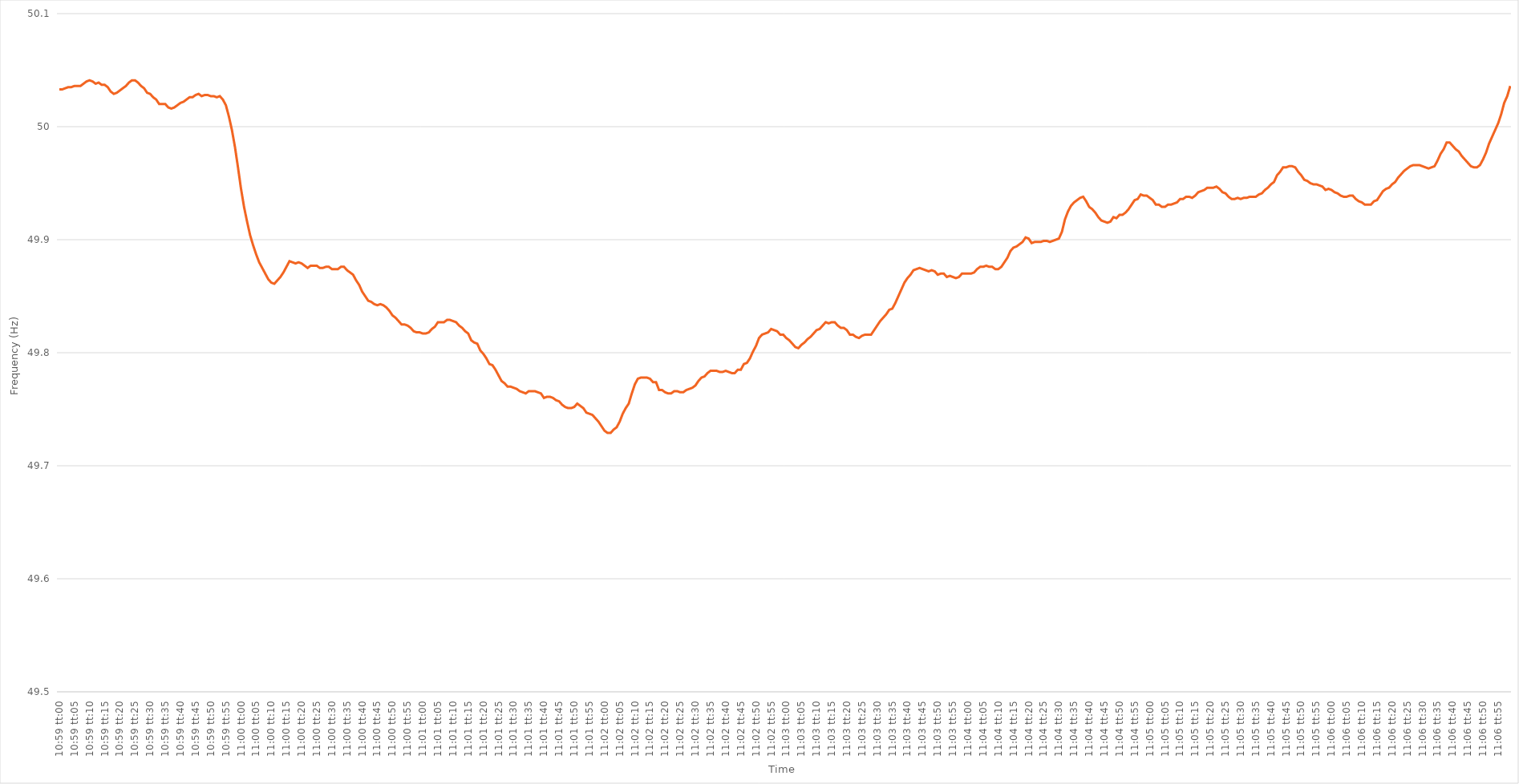
| Category | Series 0 |
|---|---|
| 0.4576388888888889 | 50.033 |
| 0.45765046296296297 | 50.033 |
| 0.457662037037037 | 50.034 |
| 0.4576736111111111 | 50.035 |
| 0.45768518518518514 | 50.035 |
| 0.4576967592592593 | 50.036 |
| 0.45770833333333333 | 50.036 |
| 0.4577199074074074 | 50.036 |
| 0.45773148148148146 | 50.038 |
| 0.45774305555555556 | 50.04 |
| 0.4577546296296296 | 50.041 |
| 0.45776620370370374 | 50.04 |
| 0.4577777777777778 | 50.038 |
| 0.4577893518518519 | 50.039 |
| 0.4578009259259259 | 50.037 |
| 0.4578125 | 50.037 |
| 0.45782407407407405 | 50.035 |
| 0.4578356481481482 | 50.031 |
| 0.45784722222222224 | 50.029 |
| 0.45785879629629633 | 50.03 |
| 0.45787037037037037 | 50.032 |
| 0.4578819444444444 | 50.034 |
| 0.4578935185185185 | 50.036 |
| 0.45790509259259254 | 50.039 |
| 0.4579166666666667 | 50.041 |
| 0.45792824074074073 | 50.041 |
| 0.4579398148148148 | 50.039 |
| 0.45795138888888887 | 50.036 |
| 0.45796296296296296 | 50.034 |
| 0.457974537037037 | 50.03 |
| 0.45798611111111115 | 50.029 |
| 0.4579976851851852 | 50.026 |
| 0.4580092592592593 | 50.024 |
| 0.4580208333333333 | 50.02 |
| 0.4580324074074074 | 50.02 |
| 0.45804398148148145 | 50.02 |
| 0.4580555555555556 | 50.017 |
| 0.45806712962962964 | 50.016 |
| 0.45807870370370374 | 50.017 |
| 0.4580902777777778 | 50.019 |
| 0.4581018518518518 | 50.021 |
| 0.4581134259259259 | 50.022 |
| 0.45812499999999995 | 50.024 |
| 0.4581365740740741 | 50.026 |
| 0.45814814814814814 | 50.026 |
| 0.45815972222222223 | 50.028 |
| 0.45817129629629627 | 50.029 |
| 0.45818287037037037 | 50.027 |
| 0.4581944444444444 | 50.028 |
| 0.45820601851851855 | 50.028 |
| 0.4582175925925926 | 50.027 |
| 0.4582291666666667 | 50.027 |
| 0.4582407407407407 | 50.026 |
| 0.4582523148148148 | 50.027 |
| 0.45826388888888886 | 50.024 |
| 0.458275462962963 | 50.019 |
| 0.45828703703703705 | 50.009 |
| 0.45829861111111114 | 49.997 |
| 0.4583101851851852 | 49.982 |
| 0.4583217592592593 | 49.964 |
| 0.4583333333333333 | 49.945 |
| 0.45834490740740735 | 49.929 |
| 0.4583564814814815 | 49.916 |
| 0.45836805555555554 | 49.904 |
| 0.45837962962962964 | 49.895 |
| 0.4583912037037037 | 49.887 |
| 0.45840277777777777 | 49.88 |
| 0.4584143518518518 | 49.875 |
| 0.45842592592592596 | 49.87 |
| 0.4584375 | 49.865 |
| 0.4584490740740741 | 49.862 |
| 0.45846064814814813 | 49.861 |
| 0.4584722222222222 | 49.864 |
| 0.45848379629629626 | 49.867 |
| 0.4584953703703704 | 49.871 |
| 0.45850694444444445 | 49.876 |
| 0.45851851851851855 | 49.881 |
| 0.4585300925925926 | 49.88 |
| 0.4585416666666667 | 49.879 |
| 0.4585532407407407 | 49.88 |
| 0.45856481481481487 | 49.879 |
| 0.4585763888888889 | 49.877 |
| 0.45858796296296295 | 49.875 |
| 0.45859953703703704 | 49.877 |
| 0.4586111111111111 | 49.877 |
| 0.4586226851851852 | 49.877 |
| 0.4586342592592592 | 49.875 |
| 0.45864583333333336 | 49.875 |
| 0.4586574074074074 | 49.876 |
| 0.4586689814814815 | 49.876 |
| 0.45868055555555554 | 49.874 |
| 0.45869212962962963 | 49.874 |
| 0.45870370370370367 | 49.874 |
| 0.4587152777777778 | 49.876 |
| 0.45872685185185186 | 49.876 |
| 0.45873842592592595 | 49.873 |
| 0.45875 | 49.871 |
| 0.4587615740740741 | 49.869 |
| 0.4587731481481481 | 49.864 |
| 0.4587847222222223 | 49.86 |
| 0.4587962962962963 | 49.854 |
| 0.45880787037037035 | 49.85 |
| 0.45881944444444445 | 49.846 |
| 0.4588310185185185 | 49.845 |
| 0.4588425925925926 | 49.843 |
| 0.4588541666666666 | 49.842 |
| 0.45886574074074077 | 49.843 |
| 0.4588773148148148 | 49.842 |
| 0.4588888888888889 | 49.84 |
| 0.45890046296296294 | 49.837 |
| 0.45891203703703703 | 49.833 |
| 0.4589236111111111 | 49.831 |
| 0.4589351851851852 | 49.828 |
| 0.45894675925925926 | 49.825 |
| 0.45895833333333336 | 49.825 |
| 0.4589699074074074 | 49.824 |
| 0.4589814814814815 | 49.822 |
| 0.45899305555555553 | 49.819 |
| 0.4590046296296297 | 49.818 |
| 0.4590162037037037 | 49.818 |
| 0.4590277777777778 | 49.817 |
| 0.45903935185185185 | 49.817 |
| 0.4590509259259259 | 49.818 |
| 0.4590625 | 49.821 |
| 0.459074074074074 | 49.823 |
| 0.4590856481481482 | 49.827 |
| 0.4590972222222222 | 49.827 |
| 0.4591087962962963 | 49.827 |
| 0.45912037037037035 | 49.829 |
| 0.45913194444444444 | 49.829 |
| 0.4591435185185185 | 49.828 |
| 0.45915509259259263 | 49.827 |
| 0.45916666666666667 | 49.824 |
| 0.45917824074074076 | 49.822 |
| 0.4591898148148148 | 49.819 |
| 0.4592013888888889 | 49.817 |
| 0.45921296296296293 | 49.811 |
| 0.4592245370370371 | 49.809 |
| 0.4592361111111111 | 49.808 |
| 0.4592476851851852 | 49.802 |
| 0.45925925925925926 | 49.799 |
| 0.45927083333333335 | 49.795 |
| 0.4592824074074074 | 49.79 |
| 0.45929398148148143 | 49.789 |
| 0.4593055555555556 | 49.785 |
| 0.4593171296296296 | 49.78 |
| 0.4593287037037037 | 49.775 |
| 0.45934027777777775 | 49.773 |
| 0.45935185185185184 | 49.77 |
| 0.4593634259259259 | 49.77 |
| 0.45937500000000003 | 49.769 |
| 0.45938657407407407 | 49.768 |
| 0.45939814814814817 | 49.766 |
| 0.4594097222222222 | 49.765 |
| 0.4594212962962963 | 49.764 |
| 0.45943287037037034 | 49.766 |
| 0.4594444444444445 | 49.766 |
| 0.4594560185185185 | 49.766 |
| 0.4594675925925926 | 49.765 |
| 0.45947916666666666 | 49.764 |
| 0.45949074074074076 | 49.76 |
| 0.4595023148148148 | 49.761 |
| 0.45951388888888894 | 49.761 |
| 0.459525462962963 | 49.76 |
| 0.459537037037037 | 49.758 |
| 0.4595486111111111 | 49.757 |
| 0.45956018518518515 | 49.754 |
| 0.45957175925925925 | 49.752 |
| 0.4595833333333333 | 49.751 |
| 0.45959490740740744 | 49.751 |
| 0.4596064814814815 | 49.752 |
| 0.45961805555555557 | 49.755 |
| 0.4596296296296296 | 49.753 |
| 0.4596412037037037 | 49.751 |
| 0.45965277777777774 | 49.747 |
| 0.4596643518518519 | 49.746 |
| 0.45967592592592593 | 49.745 |
| 0.4596875 | 49.742 |
| 0.45969907407407407 | 49.739 |
| 0.45971064814814816 | 49.735 |
| 0.4597222222222222 | 49.731 |
| 0.45973379629629635 | 49.729 |
| 0.4597453703703704 | 49.729 |
| 0.4597569444444444 | 49.732 |
| 0.4597685185185185 | 49.734 |
| 0.45978009259259256 | 49.739 |
| 0.45979166666666665 | 49.746 |
| 0.4598032407407407 | 49.751 |
| 0.45981481481481484 | 49.755 |
| 0.4598263888888889 | 49.764 |
| 0.459837962962963 | 49.772 |
| 0.459849537037037 | 49.777 |
| 0.4598611111111111 | 49.778 |
| 0.45987268518518515 | 49.778 |
| 0.4598842592592593 | 49.778 |
| 0.45989583333333334 | 49.777 |
| 0.45990740740740743 | 49.774 |
| 0.45991898148148147 | 49.774 |
| 0.45993055555555556 | 49.767 |
| 0.4599421296296296 | 49.767 |
| 0.45995370370370375 | 49.765 |
| 0.4599652777777778 | 49.764 |
| 0.4599768518518519 | 49.764 |
| 0.4599884259259259 | 49.766 |
| 0.45999999999999996 | 49.766 |
| 0.46001157407407406 | 49.765 |
| 0.4600231481481481 | 49.765 |
| 0.46003472222222225 | 49.767 |
| 0.4600462962962963 | 49.768 |
| 0.4600578703703704 | 49.769 |
| 0.4600694444444444 | 49.771 |
| 0.4600810185185185 | 49.775 |
| 0.46009259259259255 | 49.778 |
| 0.4601041666666667 | 49.779 |
| 0.46011574074074074 | 49.782 |
| 0.46012731481481484 | 49.784 |
| 0.4601388888888889 | 49.784 |
| 0.46015046296296297 | 49.784 |
| 0.460162037037037 | 49.783 |
| 0.46017361111111116 | 49.783 |
| 0.4601851851851852 | 49.784 |
| 0.4601967592592593 | 49.783 |
| 0.46020833333333333 | 49.782 |
| 0.4602199074074074 | 49.782 |
| 0.46023148148148146 | 49.785 |
| 0.4602430555555555 | 49.785 |
| 0.46025462962962965 | 49.79 |
| 0.4602662037037037 | 49.791 |
| 0.4602777777777778 | 49.795 |
| 0.4602893518518518 | 49.801 |
| 0.4603009259259259 | 49.806 |
| 0.46031249999999996 | 49.813 |
| 0.4603240740740741 | 49.816 |
| 0.46033564814814815 | 49.817 |
| 0.46034722222222224 | 49.818 |
| 0.4603587962962963 | 49.821 |
| 0.4603703703703704 | 49.82 |
| 0.4603819444444444 | 49.819 |
| 0.46039351851851856 | 49.816 |
| 0.4604050925925926 | 49.816 |
| 0.4604166666666667 | 49.813 |
| 0.46042824074074074 | 49.811 |
| 0.46043981481481483 | 49.808 |
| 0.46045138888888887 | 49.805 |
| 0.460462962962963 | 49.804 |
| 0.46047453703703706 | 49.807 |
| 0.4604861111111111 | 49.809 |
| 0.4604976851851852 | 49.812 |
| 0.46050925925925923 | 49.814 |
| 0.4605208333333333 | 49.817 |
| 0.46053240740740736 | 49.82 |
| 0.4605439814814815 | 49.821 |
| 0.46055555555555555 | 49.824 |
| 0.46056712962962965 | 49.827 |
| 0.4605787037037037 | 49.826 |
| 0.4605902777777778 | 49.827 |
| 0.4606018518518518 | 49.827 |
| 0.46061342592592597 | 49.824 |
| 0.460625 | 49.822 |
| 0.4606365740740741 | 49.822 |
| 0.46064814814814814 | 49.82 |
| 0.46065972222222223 | 49.816 |
| 0.4606712962962963 | 49.816 |
| 0.4606828703703704 | 49.814 |
| 0.46069444444444446 | 49.813 |
| 0.4607060185185185 | 49.815 |
| 0.4607175925925926 | 49.816 |
| 0.46072916666666663 | 49.816 |
| 0.46074074074074073 | 49.816 |
| 0.46075231481481477 | 49.82 |
| 0.4607638888888889 | 49.824 |
| 0.46077546296296296 | 49.828 |
| 0.46078703703703705 | 49.831 |
| 0.4607986111111111 | 49.834 |
| 0.4608101851851852 | 49.838 |
| 0.4608217592592592 | 49.839 |
| 0.4608333333333334 | 49.844 |
| 0.4608449074074074 | 49.85 |
| 0.4608564814814815 | 49.856 |
| 0.46086805555555554 | 49.862 |
| 0.46087962962962964 | 49.866 |
| 0.4608912037037037 | 49.869 |
| 0.46090277777777783 | 49.873 |
| 0.46091435185185187 | 49.874 |
| 0.46092592592592596 | 49.875 |
| 0.4609375 | 49.874 |
| 0.46094907407407404 | 49.873 |
| 0.46096064814814813 | 49.872 |
| 0.46097222222222217 | 49.873 |
| 0.4609837962962963 | 49.872 |
| 0.46099537037037036 | 49.869 |
| 0.46100694444444446 | 49.87 |
| 0.4610185185185185 | 49.87 |
| 0.4610300925925926 | 49.867 |
| 0.4610416666666666 | 49.868 |
| 0.4610532407407408 | 49.867 |
| 0.4610648148148148 | 49.866 |
| 0.4610763888888889 | 49.867 |
| 0.46108796296296295 | 49.87 |
| 0.46109953703703704 | 49.87 |
| 0.4611111111111111 | 49.87 |
| 0.46112268518518523 | 49.87 |
| 0.46113425925925927 | 49.871 |
| 0.46114583333333337 | 49.874 |
| 0.4611574074074074 | 49.876 |
| 0.4611689814814815 | 49.876 |
| 0.46118055555555554 | 49.877 |
| 0.4611921296296296 | 49.876 |
| 0.4612037037037037 | 49.876 |
| 0.46121527777777777 | 49.874 |
| 0.46122685185185186 | 49.874 |
| 0.4612384259259259 | 49.876 |
| 0.46125 | 49.88 |
| 0.46126157407407403 | 49.884 |
| 0.4612731481481482 | 49.89 |
| 0.4612847222222222 | 49.893 |
| 0.4612962962962963 | 49.894 |
| 0.46130787037037035 | 49.896 |
| 0.46131944444444445 | 49.898 |
| 0.4613310185185185 | 49.902 |
| 0.46134259259259264 | 49.901 |
| 0.4613541666666667 | 49.897 |
| 0.46136574074074077 | 49.898 |
| 0.4613773148148148 | 49.898 |
| 0.4613888888888889 | 49.898 |
| 0.46140046296296294 | 49.899 |
| 0.461412037037037 | 49.899 |
| 0.46142361111111113 | 49.898 |
| 0.46143518518518517 | 49.899 |
| 0.46144675925925926 | 49.9 |
| 0.4614583333333333 | 49.901 |
| 0.4614699074074074 | 49.907 |
| 0.46148148148148144 | 49.918 |
| 0.4614930555555556 | 49.925 |
| 0.4615046296296296 | 49.93 |
| 0.4615162037037037 | 49.933 |
| 0.46152777777777776 | 49.935 |
| 0.46153935185185185 | 49.937 |
| 0.4615509259259259 | 49.938 |
| 0.46156250000000004 | 49.934 |
| 0.4615740740740741 | 49.929 |
| 0.4615856481481482 | 49.927 |
| 0.4615972222222222 | 49.924 |
| 0.4616087962962963 | 49.92 |
| 0.46162037037037035 | 49.917 |
| 0.4616319444444445 | 49.916 |
| 0.46164351851851854 | 49.915 |
| 0.4616550925925926 | 49.916 |
| 0.46166666666666667 | 49.92 |
| 0.4616782407407407 | 49.919 |
| 0.4616898148148148 | 49.922 |
| 0.46170138888888884 | 49.922 |
| 0.461712962962963 | 49.924 |
| 0.46172453703703703 | 49.927 |
| 0.4617361111111111 | 49.931 |
| 0.46174768518518516 | 49.935 |
| 0.46175925925925926 | 49.936 |
| 0.4617708333333333 | 49.94 |
| 0.46178240740740745 | 49.939 |
| 0.4617939814814815 | 49.939 |
| 0.4618055555555556 | 49.937 |
| 0.4618171296296296 | 49.935 |
| 0.4618287037037037 | 49.931 |
| 0.46184027777777775 | 49.931 |
| 0.4618518518518519 | 49.929 |
| 0.46186342592592594 | 49.929 |
| 0.46187500000000004 | 49.931 |
| 0.4618865740740741 | 49.931 |
| 0.4618981481481481 | 49.932 |
| 0.4619097222222222 | 49.933 |
| 0.46192129629629625 | 49.936 |
| 0.4619328703703704 | 49.936 |
| 0.46194444444444444 | 49.938 |
| 0.46195601851851853 | 49.938 |
| 0.46196759259259257 | 49.937 |
| 0.46197916666666666 | 49.939 |
| 0.4619907407407407 | 49.942 |
| 0.46200231481481485 | 49.943 |
| 0.4620138888888889 | 49.944 |
| 0.462025462962963 | 49.946 |
| 0.462037037037037 | 49.946 |
| 0.4620486111111111 | 49.946 |
| 0.46206018518518516 | 49.947 |
| 0.4620717592592593 | 49.945 |
| 0.46208333333333335 | 49.942 |
| 0.46209490740740744 | 49.941 |
| 0.4621064814814815 | 49.938 |
| 0.4621180555555556 | 49.936 |
| 0.4621296296296296 | 49.936 |
| 0.46214120370370365 | 49.937 |
| 0.4621527777777778 | 49.936 |
| 0.46216435185185184 | 49.937 |
| 0.46217592592592593 | 49.937 |
| 0.4621875 | 49.938 |
| 0.46219907407407407 | 49.938 |
| 0.4622106481481481 | 49.938 |
| 0.46222222222222226 | 49.94 |
| 0.4622337962962963 | 49.941 |
| 0.4622453703703704 | 49.944 |
| 0.46225694444444443 | 49.946 |
| 0.4622685185185185 | 49.949 |
| 0.46228009259259256 | 49.951 |
| 0.4622916666666667 | 49.957 |
| 0.46230324074074075 | 49.96 |
| 0.46231481481481485 | 49.964 |
| 0.4623263888888889 | 49.964 |
| 0.462337962962963 | 49.965 |
| 0.462349537037037 | 49.965 |
| 0.46236111111111106 | 49.964 |
| 0.4623726851851852 | 49.96 |
| 0.46238425925925924 | 49.957 |
| 0.46239583333333334 | 49.953 |
| 0.4624074074074074 | 49.952 |
| 0.4624189814814815 | 49.95 |
| 0.4624305555555555 | 49.949 |
| 0.46244212962962966 | 49.949 |
| 0.4624537037037037 | 49.948 |
| 0.4624652777777778 | 49.947 |
| 0.46247685185185183 | 49.944 |
| 0.46248842592592593 | 49.945 |
| 0.46249999999999997 | 49.944 |
| 0.4625115740740741 | 49.942 |
| 0.46252314814814816 | 49.941 |
| 0.46253472222222225 | 49.939 |
| 0.4625462962962963 | 49.938 |
| 0.4625578703703704 | 49.938 |
| 0.4625694444444444 | 49.939 |
| 0.46258101851851857 | 49.939 |
| 0.4625925925925926 | 49.936 |
| 0.46260416666666665 | 49.934 |
| 0.46261574074074074 | 49.933 |
| 0.4626273148148148 | 49.931 |
| 0.4626388888888889 | 49.931 |
| 0.4626504629629629 | 49.931 |
| 0.46266203703703707 | 49.934 |
| 0.4626736111111111 | 49.935 |
| 0.4626851851851852 | 49.939 |
| 0.46269675925925924 | 49.943 |
| 0.46270833333333333 | 49.945 |
| 0.46271990740740737 | 49.946 |
| 0.4627314814814815 | 49.949 |
| 0.46274305555555556 | 49.951 |
| 0.46275462962962965 | 49.955 |
| 0.4627662037037037 | 49.958 |
| 0.4627777777777778 | 49.961 |
| 0.4627893518518518 | 49.963 |
| 0.462800925925926 | 49.965 |
| 0.4628125 | 49.966 |
| 0.4628240740740741 | 49.966 |
| 0.46283564814814815 | 49.966 |
| 0.4628472222222222 | 49.965 |
| 0.4628587962962963 | 49.964 |
| 0.4628703703703703 | 49.963 |
| 0.46288194444444447 | 49.964 |
| 0.4628935185185185 | 49.965 |
| 0.4629050925925926 | 49.97 |
| 0.46291666666666664 | 49.976 |
| 0.46292824074074074 | 49.98 |
| 0.4629398148148148 | 49.986 |
| 0.4629513888888889 | 49.986 |
| 0.46296296296296297 | 49.983 |
| 0.46297453703703706 | 49.98 |
| 0.4629861111111111 | 49.978 |
| 0.4629976851851852 | 49.974 |
| 0.46300925925925923 | 49.971 |
| 0.4630208333333334 | 49.968 |
| 0.4630324074074074 | 49.965 |
| 0.4630439814814815 | 49.964 |
| 0.46305555555555555 | 49.964 |
| 0.46306712962962965 | 49.966 |
| 0.4630787037037037 | 49.971 |
| 0.4630902777777777 | 49.977 |
| 0.4631018518518519 | 49.985 |
| 0.4631134259259259 | 49.991 |
| 0.463125 | 49.997 |
| 0.46313657407407405 | 50.003 |
| 0.46314814814814814 | 50.011 |
| 0.4631597222222222 | 50.021 |
| 0.46317129629629633 | 50.027 |
| 0.46318287037037037 | 50.036 |